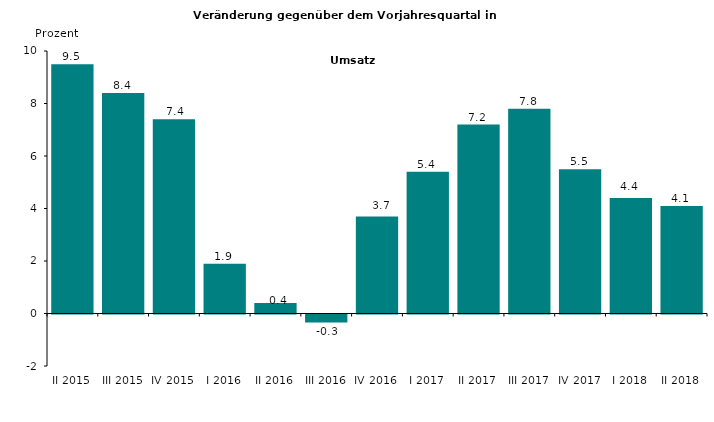
| Category | Series 0 |
|---|---|
| II 2015 | 9.5 |
| III 2015 | 8.4 |
| IV 2015 | 7.4 |
| I 2016 | 1.9 |
| II 2016 | 0.4 |
| III 2016 | -0.3 |
| IV 2016 | 3.7 |
| I 2017 | 5.4 |
| II 2017 | 7.2 |
| III 2017 | 7.8 |
| IV 2017 | 5.5 |
| I 2018 | 4.4 |
| II 2018 | 4.1 |